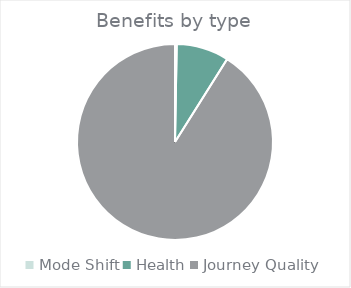
| Category | Series 0 |
|---|---|
| Mode Shift | 10.159 |
| Health | 315.548 |
| Journey Quality | 3319.614 |